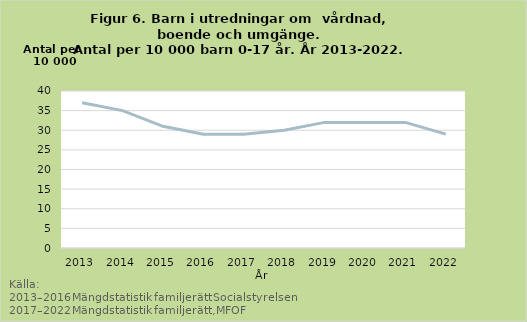
| Category | Vårdnads-, boende-, umgängesutredning |
|---|---|
| 2013.0 | 37 |
| 2014.0 | 35 |
| 2015.0 | 31 |
| 2016.0 | 29 |
| 2017.0 | 29 |
| 2018.0 | 30 |
| 2019.0 | 32 |
| 2020.0 | 32 |
| 2021.0 | 32 |
| 2022.0 | 29 |